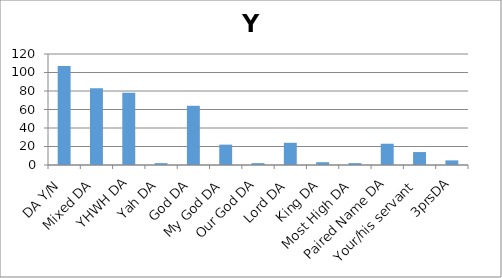
| Category | Y |
|---|---|
| DA Y/N | 107 |
| Mixed DA | 83 |
| YHWH DA | 78 |
| Yah DA | 2 |
| God DA | 64 |
| My God DA | 22 |
| Our God DA | 2 |
| Lord DA | 24 |
| King DA | 3 |
| Most High DA | 2 |
| Paired Name DA | 23 |
| Your/his servant | 14 |
| 3prsDA | 5 |